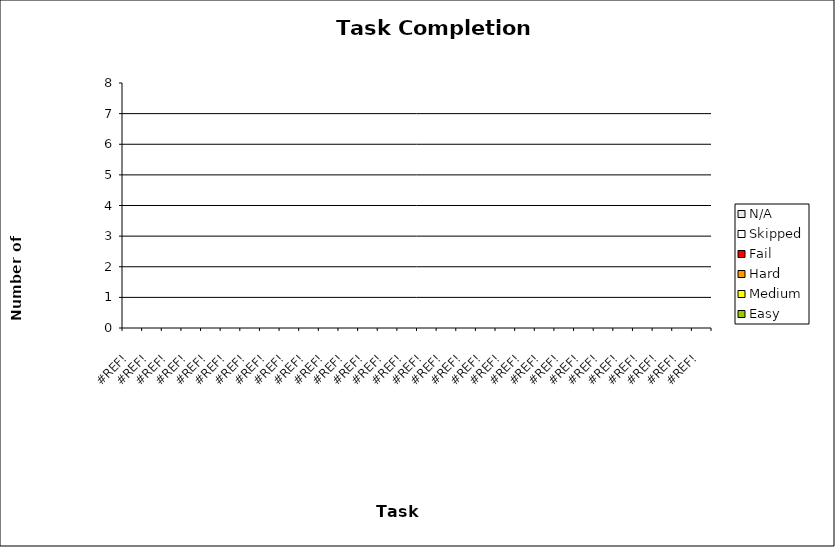
| Category | Easy | Medium | Hard | Fail | Skipped | N/A |
|---|---|---|---|---|---|---|
| 0.0 | 0 | 0 | 0 | 0 | 0 | 0 |
| 0.0 | 0 | 0 | 0 | 0 | 0 | 0 |
| 0.0 | 0 | 0 | 0 | 0 | 0 | 0 |
| 0.0 | 0 | 0 | 0 | 0 | 0 | 0 |
| 0.0 | 0 | 0 | 0 | 0 | 0 | 0 |
| 0.0 | 0 | 0 | 0 | 0 | 0 | 0 |
| 0.0 | 0 | 0 | 0 | 0 | 0 | 0 |
| 0.0 | 0 | 0 | 0 | 0 | 0 | 0 |
| 0.0 | 0 | 0 | 0 | 0 | 0 | 0 |
| 0.0 | 0 | 0 | 0 | 0 | 0 | 0 |
| 0.0 | 0 | 0 | 0 | 0 | 0 | 0 |
| 0.0 | 0 | 0 | 0 | 0 | 0 | 0 |
| 0.0 | 0 | 0 | 0 | 0 | 0 | 0 |
| 0.0 | 0 | 0 | 0 | 0 | 0 | 0 |
| 0.0 | 0 | 0 | 0 | 0 | 0 | 0 |
| 0.0 | 0 | 0 | 0 | 0 | 0 | 0 |
| 0.0 | 0 | 0 | 0 | 0 | 0 | 0 |
| 0.0 | 0 | 0 | 0 | 0 | 0 | 0 |
| 0.0 | 0 | 0 | 0 | 0 | 0 | 0 |
| 0.0 | 0 | 0 | 0 | 0 | 0 | 0 |
| 0.0 | 0 | 0 | 0 | 0 | 0 | 0 |
| 0.0 | 0 | 0 | 0 | 0 | 0 | 0 |
| 0.0 | 0 | 0 | 0 | 0 | 0 | 0 |
| 0.0 | 0 | 0 | 0 | 0 | 0 | 0 |
| 0.0 | 0 | 0 | 0 | 0 | 0 | 0 |
| 0.0 | 0 | 0 | 0 | 0 | 0 | 0 |
| 0.0 | 0 | 0 | 0 | 0 | 0 | 0 |
| 0.0 | 0 | 0 | 0 | 0 | 0 | 0 |
| 0.0 | 0 | 0 | 0 | 0 | 0 | 0 |
| 0.0 | 0 | 0 | 0 | 0 | 0 | 0 |